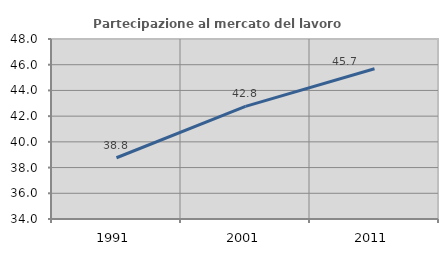
| Category | Partecipazione al mercato del lavoro  femminile |
|---|---|
| 1991.0 | 38.764 |
| 2001.0 | 42.763 |
| 2011.0 | 45.683 |